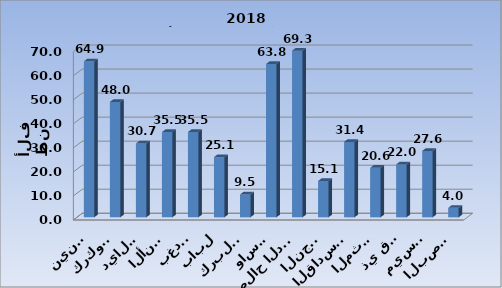
| Category | Series 0 |
|---|---|
| نينوى | 64.895 |
| كركوك | 48.022 |
| ديالى | 30.728 |
| الأنبار | 35.483 |
| بغداد | 35.503 |
| بابل | 25.069 |
| كربلاء | 9.511 |
| واسط | 63.795 |
| صلاح الدين | 69.33 |
| النجف | 15.117 |
| القادسية | 31.387 |
| المثنى | 20.609 |
| ذي قار | 22.027 |
| ميسان | 27.618 |
| البصرة | 3.96 |